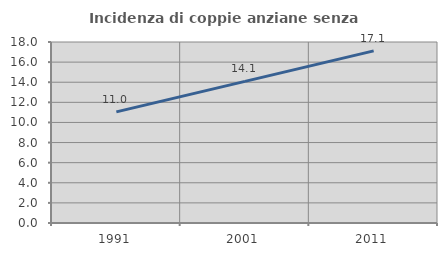
| Category | Incidenza di coppie anziane senza figli  |
|---|---|
| 1991.0 | 11.049 |
| 2001.0 | 14.086 |
| 2011.0 | 17.12 |